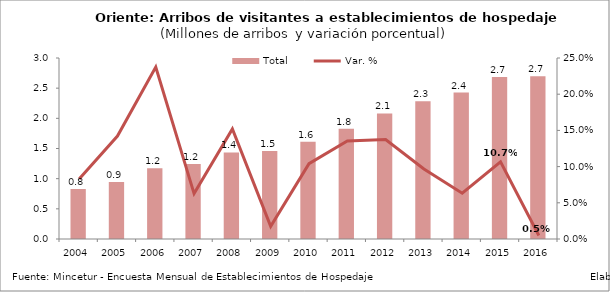
| Category | Total |
|---|---|
| 2004 | 0.829 |
| 2005 | 0.947 |
| 2006 | 1.172 |
| 2007 | 1.245 |
| 2008 | 1.434 |
| 2009 | 1.459 |
| 2010 | 1.611 |
| 2011 | 1.829 |
| 2012 | 2.081 |
| 2013 | 2.282 |
| 2014 | 2.426 |
| 2015 | 2.685 |
| 2016 | 2.698 |